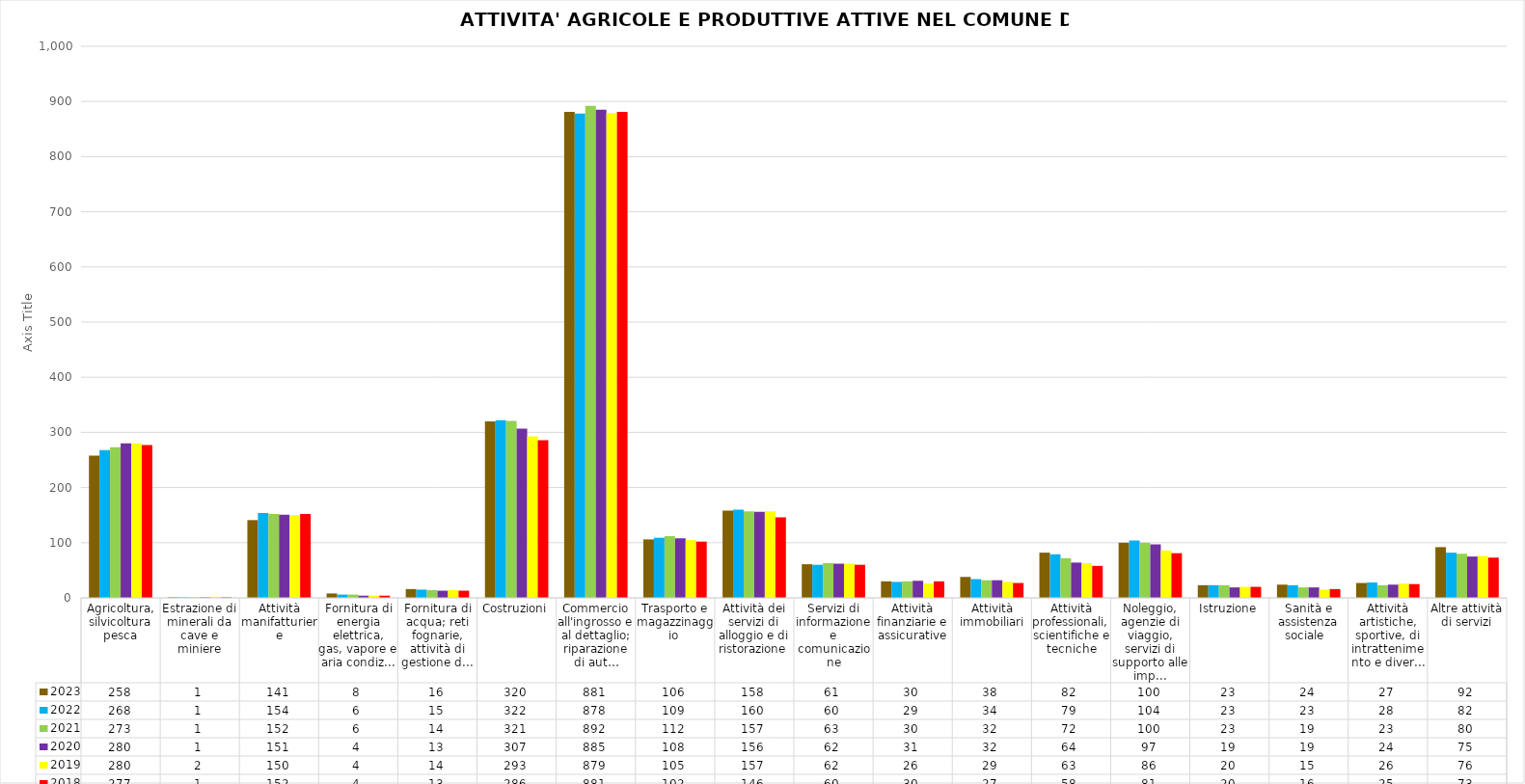
| Category | 2023 | 2022 | 2021 | 2020 | 2019 | 2018 |
|---|---|---|---|---|---|---|
| Agricoltura, silvicoltura pesca | 258 | 268 | 273 | 280 | 280 | 277 |
| Estrazione di minerali da cave e miniere | 1 | 1 | 1 | 1 | 2 | 1 |
| Attività manifatturiere | 141 | 154 | 152 | 151 | 150 | 152 |
| Fornitura di energia elettrica, gas, vapore e aria condiz... | 8 | 6 | 6 | 4 | 4 | 4 |
| Fornitura di acqua; reti fognarie, attività di gestione d... | 16 | 15 | 14 | 13 | 14 | 13 |
| Costruzioni | 320 | 322 | 321 | 307 | 293 | 286 |
| Commercio all'ingrosso e al dettaglio; riparazione di aut… | 881 | 878 | 892 | 885 | 879 | 881 |
| Trasporto e magazzinaggio  | 106 | 109 | 112 | 108 | 105 | 102 |
| Attività dei servizi di alloggio e di ristorazione  | 158 | 160 | 157 | 156 | 157 | 146 |
| Servizi di informazione e comunicazione | 61 | 60 | 63 | 62 | 62 | 60 |
| Attività finanziarie e assicurative | 30 | 29 | 30 | 31 | 26 | 30 |
| Attività immobiliari | 38 | 34 | 32 | 32 | 29 | 27 |
| Attività professionali, scientifiche e tecniche | 82 | 79 | 72 | 64 | 63 | 58 |
| Noleggio, agenzie di viaggio, servizi di supporto alle imp... | 100 | 104 | 100 | 97 | 86 | 81 |
| Istruzione | 23 | 23 | 23 | 19 | 20 | 20 |
| Sanità e assistenza sociale   | 24 | 23 | 19 | 19 | 15 | 16 |
| Attività artistiche, sportive, di intrattenimento e diver... | 27 | 28 | 23 | 24 | 26 | 25 |
| Altre attività di servizi | 92 | 82 | 80 | 75 | 76 | 73 |